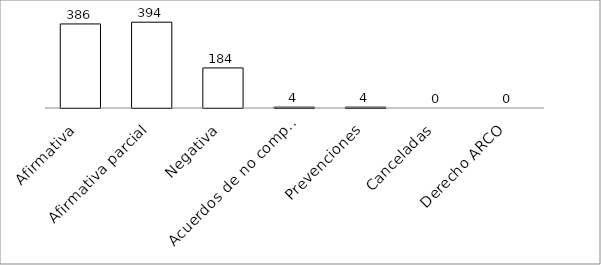
| Category | Series 0 |
|---|---|
| Afirmativa | 386 |
| Afirmativa parcial | 394 |
| Negativa | 184 |
| Acuerdos de no competencia | 4 |
| Prevenciones | 4 |
| Canceladas | 0 |
| Derecho ARCO | 0 |